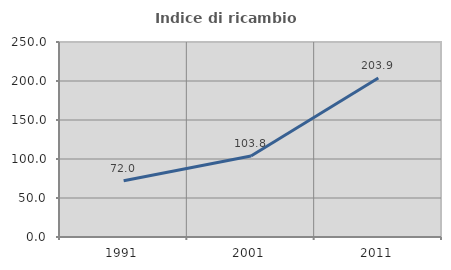
| Category | Indice di ricambio occupazionale  |
|---|---|
| 1991.0 | 72.031 |
| 2001.0 | 103.797 |
| 2011.0 | 203.933 |